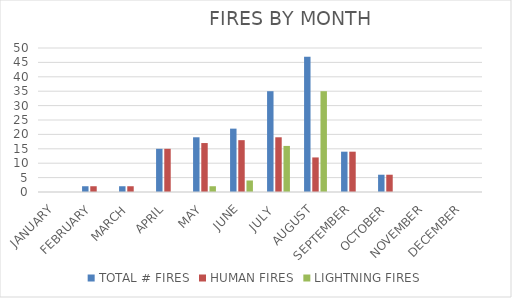
| Category | TOTAL # FIRES | HUMAN FIRES | LIGHTNING FIRES |
|---|---|---|---|
| JANUARY | 0 | 0 | 0 |
| FEBRUARY | 2 | 2 | 0 |
| MARCH | 2 | 2 | 0 |
| APRIL | 15 | 15 | 0 |
| MAY | 19 | 17 | 2 |
| JUNE | 22 | 18 | 4 |
| JULY  | 35 | 19 | 16 |
| AUGUST | 47 | 12 | 35 |
| SEPTEMBER | 14 | 14 | 0 |
| OCTOBER | 6 | 6 | 0 |
| NOVEMBER | 0 | 0 | 0 |
| DECEMBER | 0 | 0 | 0 |